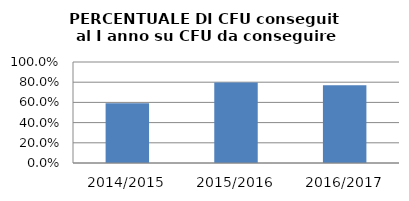
| Category | 2014/2015 2015/2016 2016/2017 |
|---|---|
| 2014/2015 | 0.592 |
| 2015/2016 | 0.796 |
| 2016/2017 | 0.769 |